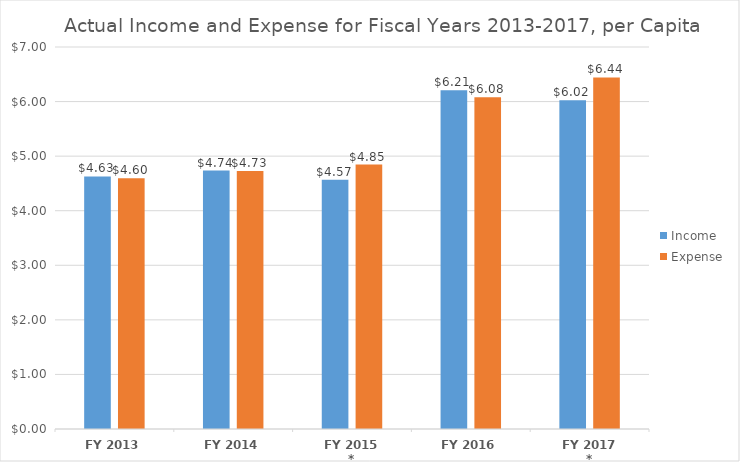
| Category | Income | Expense |
|---|---|---|
| FY 2013 | 4.629 | 4.596 |
| FY 2014 | 4.735 | 4.727 |
| FY 2015 * | 4.566 | 4.845 |
| FY 2016 | 6.209 | 6.08 |
| FY 2017 * | 6.023 | 6.441 |